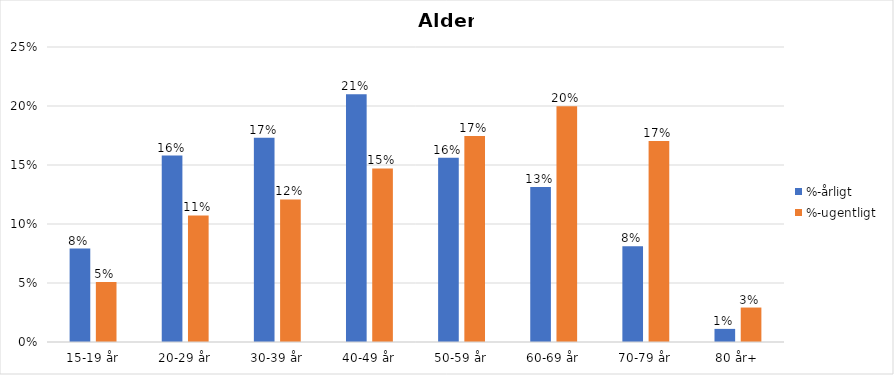
| Category | %-årligt | %-ugentligt |
|---|---|---|
| 15-19 år | 0.079 | 0.051 |
| 20-29 år | 0.158 | 0.107 |
| 30-39 år | 0.173 | 0.121 |
| 40-49 år | 0.21 | 0.147 |
| 50-59 år | 0.156 | 0.175 |
| 60-69 år | 0.131 | 0.2 |
| 70-79 år | 0.081 | 0.17 |
| 80 år+ | 0.011 | 0.029 |